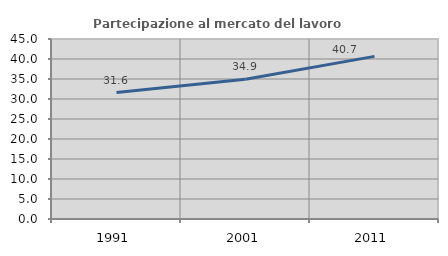
| Category | Partecipazione al mercato del lavoro  femminile |
|---|---|
| 1991.0 | 31.603 |
| 2001.0 | 34.948 |
| 2011.0 | 40.651 |